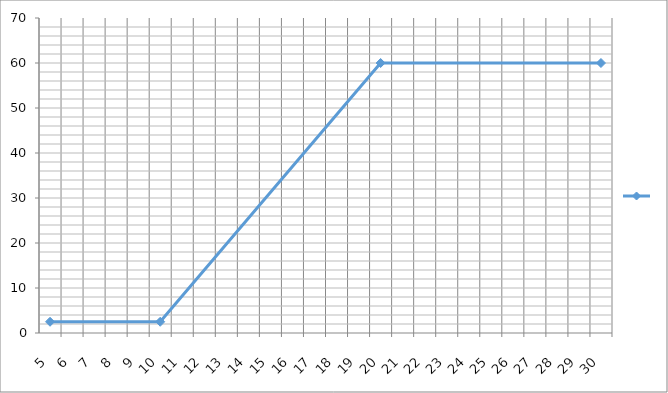
| Category | Series 0 |
|---|---|
| 5.0 | 2.5 |
| 10.0 | 2.5 |
| 20.0 | 60 |
| 30.0 | 60 |